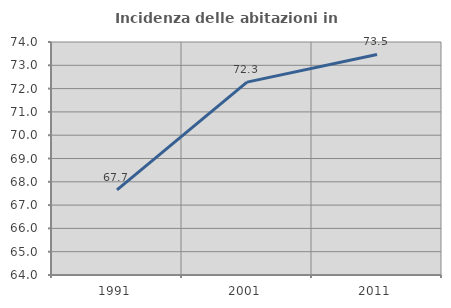
| Category | Incidenza delle abitazioni in proprietà  |
|---|---|
| 1991.0 | 67.654 |
| 2001.0 | 72.277 |
| 2011.0 | 73.466 |